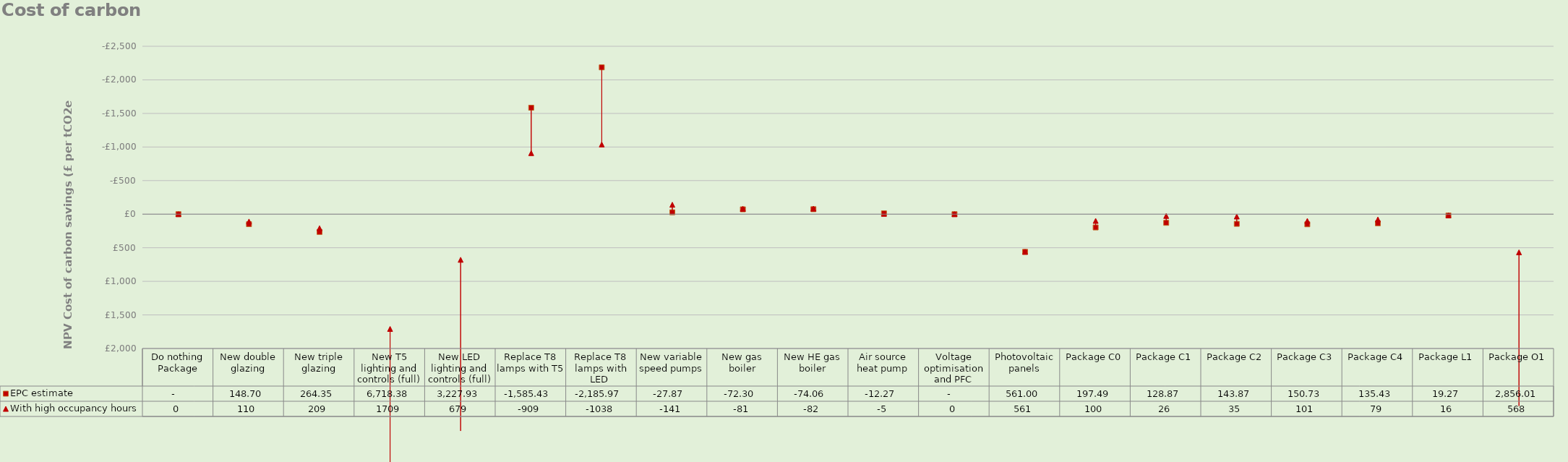
| Category | EPC estimate | With high occupancy hours |
|---|---|---|
| Do nothing Package | 0 | 0 |
| New double glazing | 148.702 | 109.599 |
| New triple glazing | 264.353 | 209.298 |
| New T5 lighting and controls (full) | 6718.378 | 1708.7 |
| New LED lighting and controls (full) | 3227.933 | 679.287 |
| Replace T8 lamps with T5 | -1585.43 | -909.145 |
| Replace T8 lamps with LED  | -2185.973 | -1037.674 |
| New variable speed pumps | -27.871 | -140.572 |
| New gas boiler | -72.297 | -80.917 |
| New HE gas boiler | -74.061 | -82.438 |
| Air source heat pump | -12.269 | -5.013 |
| Voltage optimisation and PFC | 0 | 0 |
| Photovoltaic panels | 561.003 | 561.003 |
| Package C0 | 197.492 | 99.787 |
| Package C1 | 128.868 | 26.309 |
| Package C2 | 143.872 | 35.025 |
| Package C3 | 150.732 | 100.576 |
| Package C4 | 135.428 | 79.216 |
| Package L1 | 19.268 | 16.085 |
| Package O1 | 2856.009 | 568.228 |